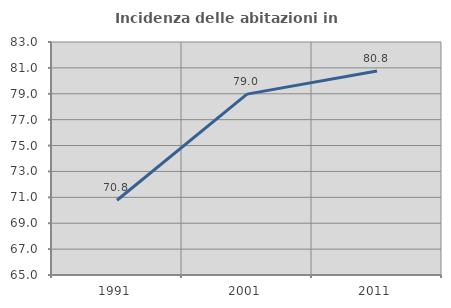
| Category | Incidenza delle abitazioni in proprietà  |
|---|---|
| 1991.0 | 70.774 |
| 2001.0 | 78.975 |
| 2011.0 | 80.756 |